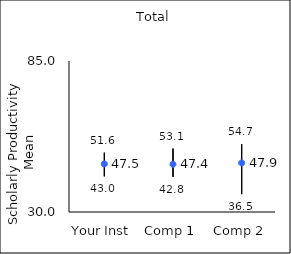
| Category | 25th percentile | 75th percentile | Mean |
|---|---|---|---|
| Your Inst | 43 | 51.6 | 47.52 |
| Comp 1 | 42.8 | 53.1 | 47.39 |
| Comp 2 | 36.5 | 54.7 | 47.87 |